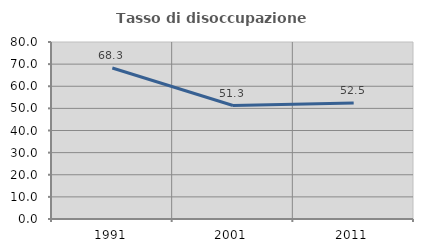
| Category | Tasso di disoccupazione giovanile  |
|---|---|
| 1991.0 | 68.263 |
| 2001.0 | 51.282 |
| 2011.0 | 52.469 |